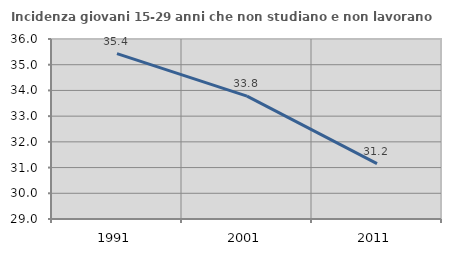
| Category | Incidenza giovani 15-29 anni che non studiano e non lavorano  |
|---|---|
| 1991.0 | 35.431 |
| 2001.0 | 33.778 |
| 2011.0 | 31.152 |